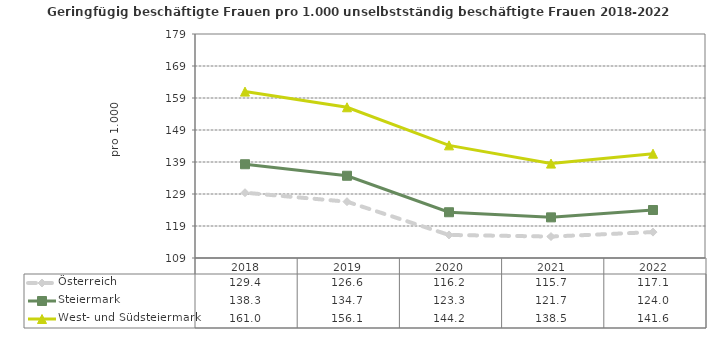
| Category | Österreich | Steiermark | West- und Südsteiermark |
|---|---|---|---|
| 2022.0 | 117.1 | 124 | 141.6 |
| 2021.0 | 115.7 | 121.7 | 138.5 |
| 2020.0 | 116.2 | 123.3 | 144.2 |
| 2019.0 | 126.6 | 134.7 | 156.1 |
| 2018.0 | 129.4 | 138.3 | 161 |